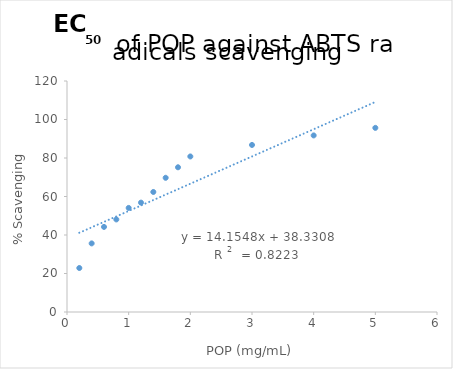
| Category | Series 0 |
|---|---|
| 0.2 | 22.85 |
| 0.4 | 35.637 |
| 0.6 | 44.203 |
| 0.8 | 48.087 |
| 1.0 | 54.063 |
| 1.2 | 56.817 |
| 1.4 | 62.35 |
| 1.6 | 69.717 |
| 1.8 | 75.177 |
| 2.0 | 80.797 |
| 3.0 | 86.783 |
| 4.0 | 91.727 |
| 5.0 | 95.653 |